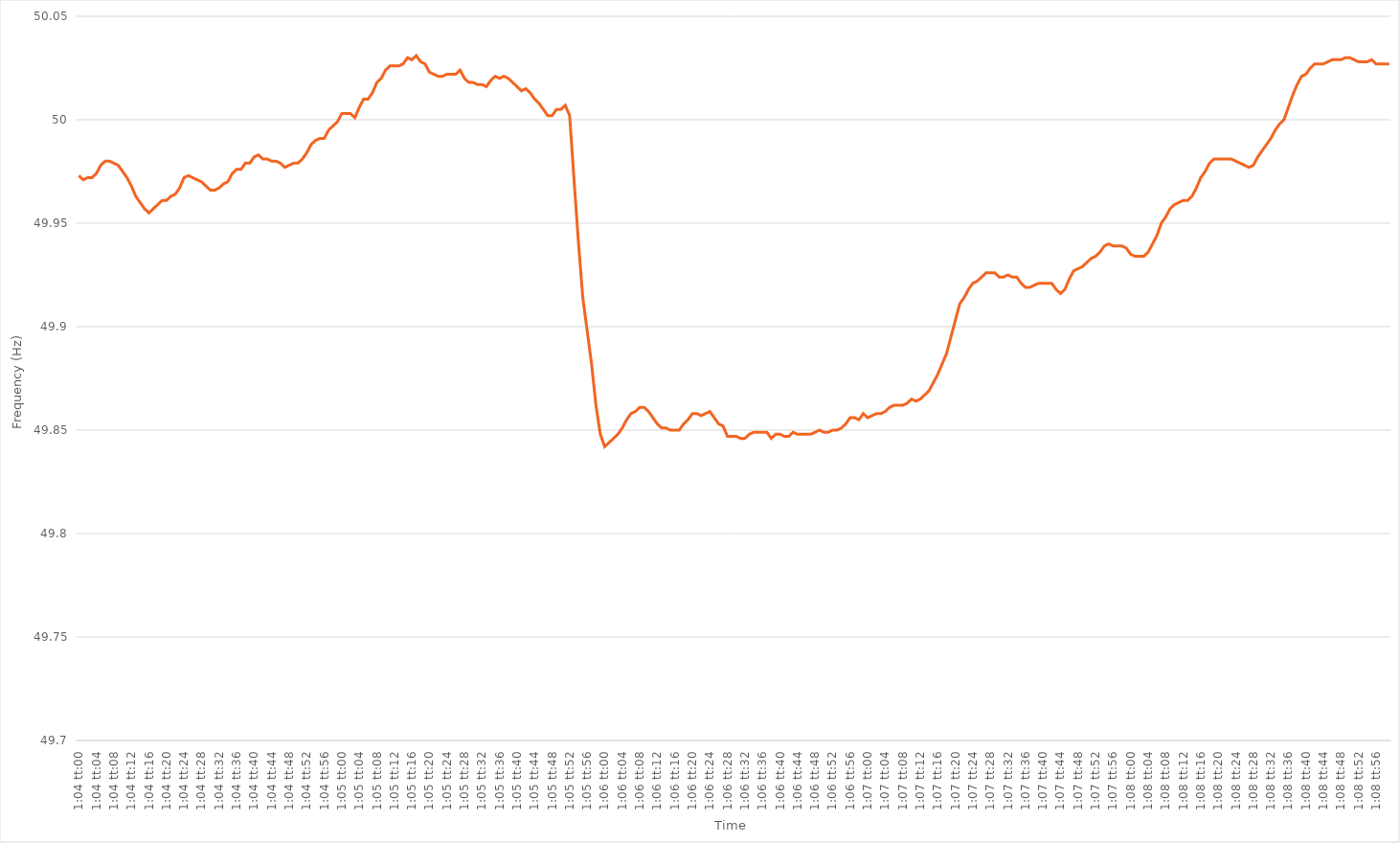
| Category | Series 0 |
|---|---|
| 0.044444444444444446 | 49.973 |
| 0.04445601851851852 | 49.971 |
| 0.04446759259259259 | 49.972 |
| 0.04447916666666666 | 49.972 |
| 0.04449074074074074 | 49.974 |
| 0.044502314814814814 | 49.978 |
| 0.04451388888888889 | 49.98 |
| 0.04452546296296297 | 49.98 |
| 0.04453703703703704 | 49.979 |
| 0.04454861111111111 | 49.978 |
| 0.04456018518518518 | 49.975 |
| 0.04457175925925926 | 49.972 |
| 0.044583333333333336 | 49.968 |
| 0.04459490740740741 | 49.963 |
| 0.044606481481481476 | 49.96 |
| 0.04461805555555556 | 49.957 |
| 0.04462962962962963 | 49.955 |
| 0.044641203703703704 | 49.957 |
| 0.044652777777777784 | 49.959 |
| 0.04466435185185185 | 49.961 |
| 0.044675925925925924 | 49.961 |
| 0.0446875 | 49.963 |
| 0.04469907407407408 | 49.964 |
| 0.04471064814814815 | 49.967 |
| 0.04472222222222222 | 49.972 |
| 0.04473379629629629 | 49.973 |
| 0.04474537037037037 | 49.972 |
| 0.044756944444444446 | 49.971 |
| 0.04476851851851852 | 49.97 |
| 0.04478009259259259 | 49.968 |
| 0.04479166666666667 | 49.966 |
| 0.04480324074074074 | 49.966 |
| 0.044814814814814814 | 49.967 |
| 0.044826388888888895 | 49.969 |
| 0.04483796296296296 | 49.97 |
| 0.044849537037037035 | 49.974 |
| 0.04486111111111111 | 49.976 |
| 0.04487268518518519 | 49.976 |
| 0.04488425925925926 | 49.979 |
| 0.04489583333333333 | 49.979 |
| 0.0449074074074074 | 49.982 |
| 0.04491898148148148 | 49.983 |
| 0.04493055555555556 | 49.981 |
| 0.04494212962962963 | 49.981 |
| 0.0449537037037037 | 49.98 |
| 0.04496527777777778 | 49.98 |
| 0.04497685185185185 | 49.979 |
| 0.044988425925925925 | 49.977 |
| 0.045000000000000005 | 49.978 |
| 0.04501157407407407 | 49.979 |
| 0.045023148148148145 | 49.979 |
| 0.04503472222222222 | 49.981 |
| 0.0450462962962963 | 49.984 |
| 0.04505787037037037 | 49.988 |
| 0.04506944444444445 | 49.99 |
| 0.04508101851851851 | 49.991 |
| 0.045092592592592594 | 49.991 |
| 0.04510416666666667 | 49.995 |
| 0.04511574074074074 | 49.997 |
| 0.04512731481481482 | 49.999 |
| 0.04513888888888889 | 50.003 |
| 0.04515046296296296 | 50.003 |
| 0.045162037037037035 | 50.003 |
| 0.045173611111111116 | 50.001 |
| 0.04518518518518519 | 50.006 |
| 0.045196759259259256 | 50.01 |
| 0.04520833333333333 | 50.01 |
| 0.04521990740740741 | 50.013 |
| 0.045231481481481484 | 50.018 |
| 0.04524305555555556 | 50.02 |
| 0.045254629629629624 | 50.024 |
| 0.045266203703703704 | 50.026 |
| 0.04527777777777778 | 50.026 |
| 0.04528935185185185 | 50.026 |
| 0.04530092592592593 | 50.027 |
| 0.0453125 | 50.03 |
| 0.04532407407407407 | 50.029 |
| 0.045335648148148146 | 50.031 |
| 0.045347222222222226 | 50.028 |
| 0.0453587962962963 | 50.027 |
| 0.045370370370370366 | 50.023 |
| 0.04538194444444444 | 50.022 |
| 0.04539351851851852 | 50.021 |
| 0.045405092592592594 | 50.021 |
| 0.04541666666666667 | 50.022 |
| 0.045428240740740734 | 50.022 |
| 0.045439814814814815 | 50.022 |
| 0.04545138888888889 | 50.024 |
| 0.04546296296296296 | 50.02 |
| 0.04547453703703704 | 50.018 |
| 0.04548611111111111 | 50.018 |
| 0.04549768518518518 | 50.017 |
| 0.045509259259259256 | 50.017 |
| 0.04552083333333334 | 50.016 |
| 0.04553240740740741 | 50.019 |
| 0.04554398148148148 | 50.021 |
| 0.04555555555555555 | 50.02 |
| 0.04556712962962963 | 50.021 |
| 0.045578703703703705 | 50.02 |
| 0.04559027777777778 | 50.018 |
| 0.04560185185185186 | 50.016 |
| 0.045613425925925925 | 50.014 |
| 0.045625 | 50.015 |
| 0.04563657407407407 | 50.013 |
| 0.04564814814814815 | 50.01 |
| 0.04565972222222223 | 50.008 |
| 0.04567129629629629 | 50.005 |
| 0.04568287037037037 | 50.002 |
| 0.04569444444444445 | 50.002 |
| 0.04570601851851852 | 50.005 |
| 0.045717592592592594 | 50.005 |
| 0.04572916666666666 | 50.007 |
| 0.04574074074074074 | 50.002 |
| 0.045752314814814815 | 49.971 |
| 0.04576388888888889 | 49.941 |
| 0.04577546296296297 | 49.914 |
| 0.045787037037037036 | 49.898 |
| 0.04579861111111111 | 49.882 |
| 0.04581018518518518 | 49.862 |
| 0.04582175925925926 | 49.848 |
| 0.04583333333333334 | 49.842 |
| 0.045844907407407404 | 49.844 |
| 0.04585648148148148 | 49.846 |
| 0.04586805555555556 | 49.848 |
| 0.04587962962962963 | 49.851 |
| 0.045891203703703705 | 49.855 |
| 0.04590277777777777 | 49.858 |
| 0.04591435185185185 | 49.859 |
| 0.045925925925925926 | 49.861 |
| 0.0459375 | 49.861 |
| 0.04594907407407408 | 49.859 |
| 0.045960648148148146 | 49.856 |
| 0.04597222222222222 | 49.853 |
| 0.04598379629629629 | 49.851 |
| 0.045995370370370374 | 49.851 |
| 0.04600694444444445 | 49.85 |
| 0.046018518518518514 | 49.85 |
| 0.04603009259259259 | 49.85 |
| 0.04604166666666667 | 49.853 |
| 0.04605324074074074 | 49.855 |
| 0.046064814814814815 | 49.858 |
| 0.04607638888888888 | 49.858 |
| 0.04608796296296296 | 49.857 |
| 0.046099537037037036 | 49.858 |
| 0.04611111111111111 | 49.859 |
| 0.04612268518518519 | 49.856 |
| 0.046134259259259264 | 49.853 |
| 0.04614583333333333 | 49.852 |
| 0.046157407407407404 | 49.847 |
| 0.046168981481481484 | 49.847 |
| 0.04618055555555556 | 49.847 |
| 0.04619212962962963 | 49.846 |
| 0.0462037037037037 | 49.846 |
| 0.04621527777777778 | 49.848 |
| 0.04622685185185185 | 49.849 |
| 0.046238425925925926 | 49.849 |
| 0.046250000000000006 | 49.849 |
| 0.04626157407407407 | 49.849 |
| 0.04627314814814815 | 49.846 |
| 0.04628472222222222 | 49.848 |
| 0.0462962962962963 | 49.848 |
| 0.046307870370370374 | 49.847 |
| 0.04631944444444444 | 49.847 |
| 0.046331018518518514 | 49.849 |
| 0.046342592592592595 | 49.848 |
| 0.04635416666666667 | 49.848 |
| 0.04636574074074074 | 49.848 |
| 0.04637731481481481 | 49.848 |
| 0.04638888888888889 | 49.849 |
| 0.04640046296296296 | 49.85 |
| 0.046412037037037036 | 49.849 |
| 0.04642361111111112 | 49.849 |
| 0.046435185185185184 | 49.85 |
| 0.04644675925925926 | 49.85 |
| 0.04645833333333333 | 49.851 |
| 0.04646990740740741 | 49.853 |
| 0.046481481481481485 | 49.856 |
| 0.04649305555555555 | 49.856 |
| 0.046504629629629625 | 49.855 |
| 0.046516203703703705 | 49.858 |
| 0.04652777777777778 | 49.856 |
| 0.04653935185185185 | 49.857 |
| 0.04655092592592592 | 49.858 |
| 0.0465625 | 49.858 |
| 0.04657407407407407 | 49.859 |
| 0.04658564814814815 | 49.861 |
| 0.04659722222222223 | 49.862 |
| 0.046608796296296294 | 49.862 |
| 0.04662037037037037 | 49.862 |
| 0.04663194444444444 | 49.863 |
| 0.04664351851851852 | 49.865 |
| 0.046655092592592595 | 49.864 |
| 0.04666666666666667 | 49.865 |
| 0.046678240740740735 | 49.867 |
| 0.046689814814814816 | 49.869 |
| 0.04670138888888889 | 49.873 |
| 0.04671296296296296 | 49.877 |
| 0.046724537037037044 | 49.882 |
| 0.04673611111111111 | 49.887 |
| 0.046747685185185184 | 49.895 |
| 0.04675925925925926 | 49.903 |
| 0.04677083333333334 | 49.911 |
| 0.04678240740740741 | 49.914 |
| 0.04679398148148148 | 49.918 |
| 0.04680555555555555 | 49.921 |
| 0.04681712962962963 | 49.922 |
| 0.046828703703703706 | 49.924 |
| 0.04684027777777778 | 49.926 |
| 0.046851851851851846 | 49.926 |
| 0.046863425925925926 | 49.926 |
| 0.046875 | 49.924 |
| 0.046886574074074074 | 49.924 |
| 0.046898148148148154 | 49.925 |
| 0.04690972222222222 | 49.924 |
| 0.046921296296296294 | 49.924 |
| 0.04693287037037037 | 49.921 |
| 0.04694444444444445 | 49.919 |
| 0.04695601851851852 | 49.919 |
| 0.04696759259259259 | 49.92 |
| 0.04697916666666666 | 49.921 |
| 0.04699074074074074 | 49.921 |
| 0.047002314814814816 | 49.921 |
| 0.04701388888888889 | 49.921 |
| 0.04702546296296297 | 49.918 |
| 0.04703703703703704 | 49.916 |
| 0.04704861111111111 | 49.918 |
| 0.047060185185185184 | 49.923 |
| 0.047071759259259265 | 49.927 |
| 0.04708333333333333 | 49.928 |
| 0.047094907407407405 | 49.929 |
| 0.04710648148148148 | 49.931 |
| 0.04711805555555556 | 49.933 |
| 0.04712962962962963 | 49.934 |
| 0.047141203703703706 | 49.936 |
| 0.04715277777777777 | 49.939 |
| 0.04716435185185185 | 49.94 |
| 0.04717592592592593 | 49.939 |
| 0.0471875 | 49.939 |
| 0.04719907407407407 | 49.939 |
| 0.04721064814814815 | 49.938 |
| 0.04722222222222222 | 49.935 |
| 0.047233796296296295 | 49.934 |
| 0.047245370370370375 | 49.934 |
| 0.04725694444444445 | 49.934 |
| 0.047268518518518515 | 49.936 |
| 0.04728009259259259 | 49.94 |
| 0.04729166666666667 | 49.944 |
| 0.04730324074074074 | 49.95 |
| 0.04731481481481481 | 49.953 |
| 0.04732638888888888 | 49.957 |
| 0.047337962962962964 | 49.959 |
| 0.04734953703703704 | 49.96 |
| 0.04736111111111111 | 49.961 |
| 0.04737268518518519 | 49.961 |
| 0.04738425925925926 | 49.963 |
| 0.04739583333333333 | 49.967 |
| 0.047407407407407405 | 49.972 |
| 0.047418981481481486 | 49.975 |
| 0.04743055555555556 | 49.979 |
| 0.047442129629629626 | 49.981 |
| 0.0474537037037037 | 49.981 |
| 0.04746527777777778 | 49.981 |
| 0.04747685185185185 | 49.981 |
| 0.04748842592592593 | 49.981 |
| 0.04750000000000001 | 49.98 |
| 0.047511574074074074 | 49.979 |
| 0.04752314814814815 | 49.978 |
| 0.04753472222222222 | 49.977 |
| 0.0475462962962963 | 49.978 |
| 0.04755787037037037 | 49.982 |
| 0.04756944444444444 | 49.985 |
| 0.047581018518518516 | 49.988 |
| 0.047592592592592596 | 49.991 |
| 0.04760416666666667 | 49.995 |
| 0.04761574074074074 | 49.998 |
| 0.04762731481481481 | 50 |
| 0.04763888888888889 | 50.006 |
| 0.047650462962962964 | 50.012 |
| 0.04766203703703704 | 50.017 |
| 0.047673611111111104 | 50.021 |
| 0.047685185185185185 | 50.022 |
| 0.04769675925925926 | 50.025 |
| 0.04770833333333333 | 50.027 |
| 0.04771990740740741 | 50.027 |
| 0.047731481481481486 | 50.027 |
| 0.04774305555555555 | 50.028 |
| 0.047754629629629626 | 50.029 |
| 0.04776620370370371 | 50.029 |
| 0.04777777777777778 | 50.029 |
| 0.04778935185185185 | 50.03 |
| 0.04780092592592592 | 50.03 |
| 0.0478125 | 50.029 |
| 0.047824074074074074 | 50.028 |
| 0.04783564814814815 | 50.028 |
| 0.04784722222222223 | 50.028 |
| 0.047858796296296295 | 50.029 |
| 0.04787037037037037 | 50.027 |
| 0.04788194444444444 | 50.027 |
| 0.04789351851851852 | 50.027 |
| 0.04790509259259259 | 50.027 |